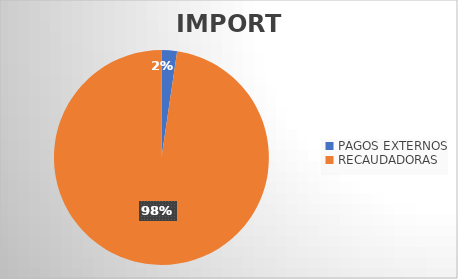
| Category | IMPORTE |
|---|---|
| PAGOS EXTERNOS | 11021190.06 |
| RECAUDADORAS | 462458872.86 |